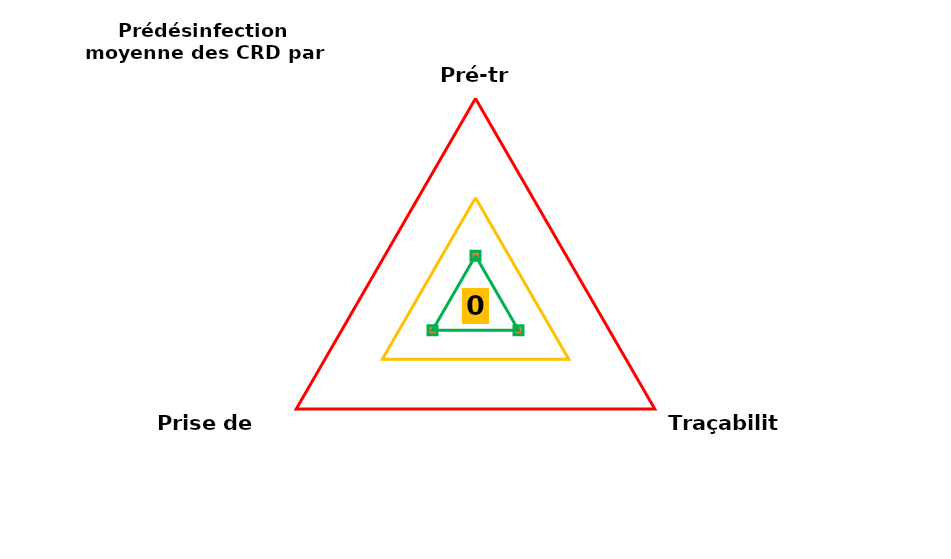
| Category | Series 0 | Series 1 | Series 2 | Series 3 |
|---|---|---|---|---|
| Pré-tri | 0 | 6 | 13 | 25 |
| Traçabilité | 0 | 6 | 13 | 25 |
| Prise de poste | 0 | 6 | 13 | 25 |